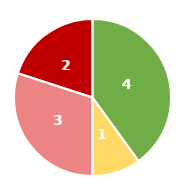
| Category | Series 0 |
|---|---|
| Niedrig | 4 |
| Mittel | 1 |
| Hoch | 3 |
| Kritisch | 2 |